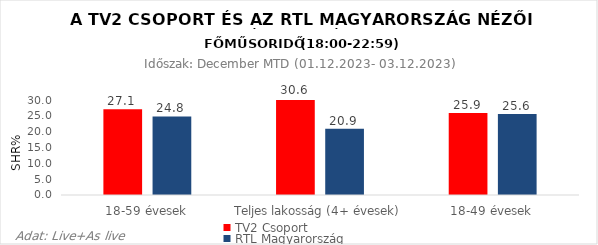
| Category | TV2 Csoport | RTL Magyarország |
|---|---|---|
| 18-59 évesek | 27.1 | 24.8 |
| Teljes lakosság (4+ évesek) | 30.6 | 20.9 |
| 18-49 évesek | 25.9 | 25.6 |